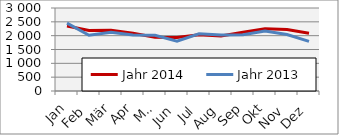
| Category | Jahr 2014 | Jahr 2013 |
|---|---|---|
| Jan | 2348.498 | 2453.338 |
| Feb | 2184.692 | 2014.409 |
| Mär | 2199.162 | 2122.774 |
| Apr | 2084.903 | 2026.78 |
| Mai | 1944.999 | 2011.73 |
| Jun | 1937.712 | 1801.703 |
| Jul | 2033.372 | 2065.068 |
| Aug | 1990.23 | 2021.865 |
| Sep | 2123.817 | 2035.889 |
| Okt | 2246.039 | 2166.603 |
| Nov | 2222.49 | 2043.401 |
| Dez | 2089.986 | 1792.44 |